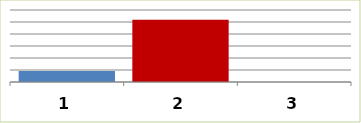
| Category | Series 0 |
|---|---|
| 0 | 459858 |
| 1 | 2595000 |
| 2 | 0 |